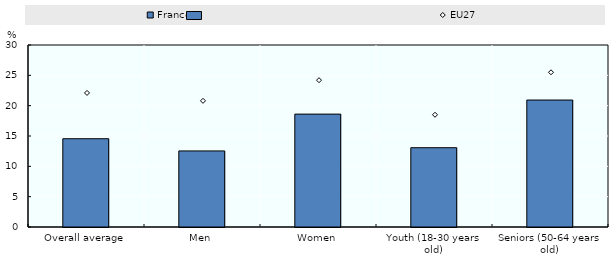
| Category | France |
|---|---|
| Overall average | 14.552 |
| Men | 12.539 |
| Women | 18.607 |
| Youth (18-30 years old) | 13.07 |
| Seniors (50-64 years old) | 20.927 |